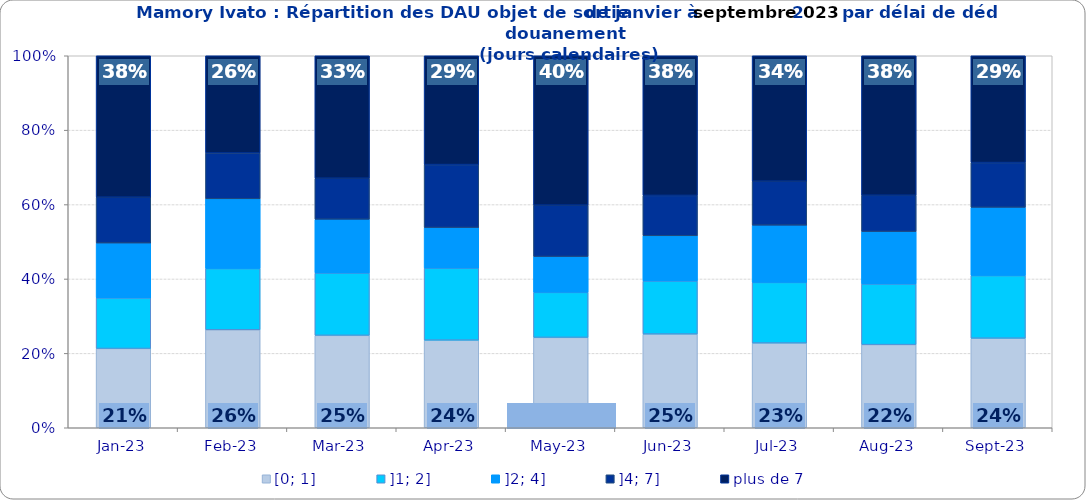
| Category | [0; 1] | ]1; 2] | ]2; 4] | ]4; 7] | plus de 7 |
|---|---|---|---|---|---|
| 2023-01-01 | 0.213 | 0.136 | 0.148 | 0.123 | 0.38 |
| 2023-02-01 | 0.263 | 0.165 | 0.187 | 0.123 | 0.261 |
| 2023-03-01 | 0.248 | 0.168 | 0.145 | 0.11 | 0.329 |
| 2023-04-01 | 0.235 | 0.194 | 0.109 | 0.169 | 0.293 |
| 2023-05-01 | 0.243 | 0.121 | 0.096 | 0.138 | 0.402 |
| 2023-06-01 | 0.252 | 0.143 | 0.122 | 0.108 | 0.376 |
| 2023-07-01 | 0.228 | 0.163 | 0.154 | 0.118 | 0.337 |
| 2023-08-01 | 0.223 | 0.163 | 0.141 | 0.098 | 0.375 |
| 2023-09-01 | 0.241 | 0.168 | 0.183 | 0.12 | 0.287 |